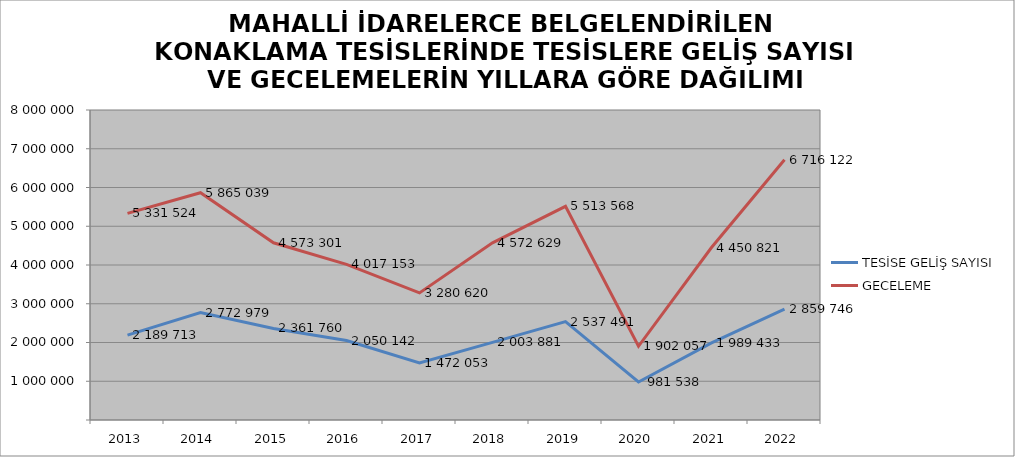
| Category | TESİSE GELİŞ SAYISI | GECELEME |
|---|---|---|
| 2013 | 2189713 | 5331524 |
| 2014 | 2772979 | 5865039 |
| 2015 | 2361760 | 4573301 |
| 2016 | 2050142 | 4017153 |
| 2017 | 1472053 | 3280620 |
| 2018 | 2003881 | 4572629 |
| 2019 | 2537491 | 5513568 |
| 2020 | 981538 | 1902057 |
| 2021 | 1989433 | 4450821 |
| 2022 | 2859746 | 6716122 |